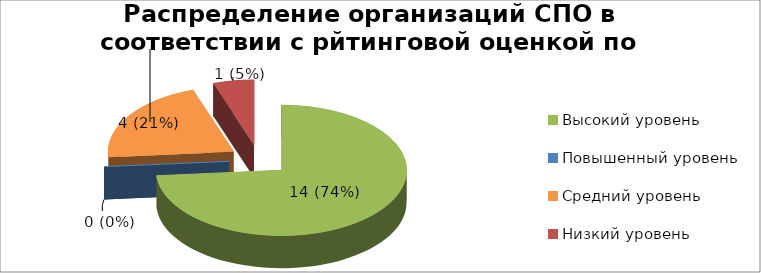
| Category | Series 8 | Series 9 |
|---|---|---|
| Высокий уровень | 0.737 |  |
| Повышенный уровень | 0 |  |
| Средний уровень | 0.211 |  |
| Низкий уровень | 0.053 |  |